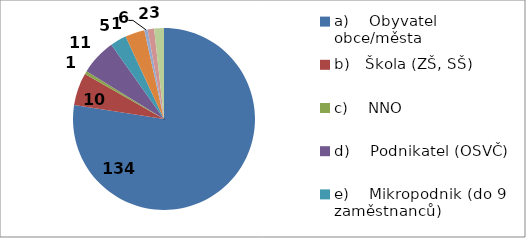
| Category | Series 0 |
|---|---|
| a)    Obyvatel obce/města | 134 |
| b)   Škola (ZŠ, SŠ) | 10 |
| c)    NNO | 1 |
| d)    Podnikatel (OSVČ) | 11 |
| e)    Mikropodnik (do 9 zaměstnanců) | 5 |
| f)     Malý podnik  (10 až 49 zaměstnanců) | 6 |
| g)   Střední podnik  (50 až 249 zaměstnanců) | 1 |
| h)    Velký podnik  (250 a více zaměstnanců) | 2 |
| i)    Jiné: škola voš, příspěvková organizace města | 3 |